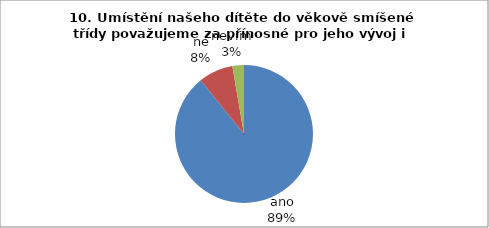
| Category | 10. Umístění našeho dítěte do věkově smíšené třídy považujeme za přínosné pro jeho vývoj i učení. |
|---|---|
| ano | 33 |
| ne | 3 |
| nevím | 1 |